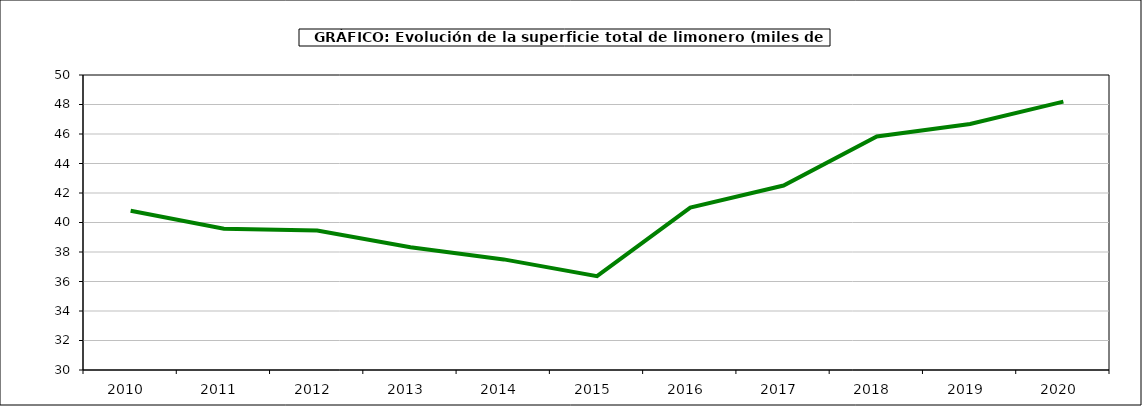
| Category | superficie |
|---|---|
| 2010.0 | 40.801 |
| 2011.0 | 39.571 |
| 2012.0 | 39.463 |
| 2013.0 | 38.319 |
| 2014.0 | 37.498 |
| 2015.0 | 36.363 |
| 2016.0 | 41.009 |
| 2017.0 | 42.507 |
| 2018.0 | 45.832 |
| 2019.0 | 46.684 |
| 2020.0 | 48.196 |